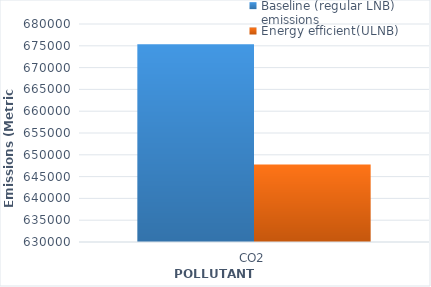
| Category | Baseline (regular LNB) emissions  | Energy efficient(ULNB) emissions  |
|---|---|---|
| CO2 | 675368.767 | 647802.695 |